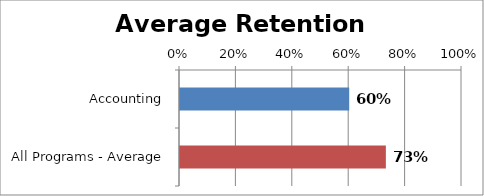
| Category | RetentionRate |
|---|---|
| Accounting | 0.6 |
| All Programs - Average | 0.73 |